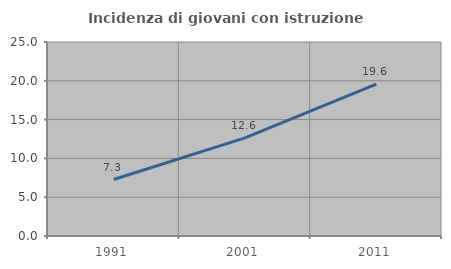
| Category | Incidenza di giovani con istruzione universitaria |
|---|---|
| 1991.0 | 7.279 |
| 2001.0 | 12.648 |
| 2011.0 | 19.565 |